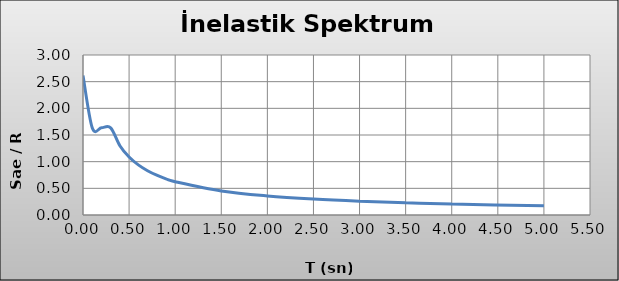
| Category | Series 0 |
|---|---|
| 0.0 | 2.616 |
| 0.1 | 1.635 |
| 0.2 | 1.635 |
| 0.3 | 1.635 |
| 0.4 | 1.299 |
| 0.5 | 1.087 |
| 0.6 | 0.939 |
| 0.7 | 0.83 |
| 0.8 | 0.746 |
| 0.9 | 0.679 |
| 1.0 | 0.624 |
| 1.5 | 0.451 |
| 2.0 | 0.358 |
| 2.5 | 0.3 |
| 3.0 | 0.259 |
| 3.5 | 0.229 |
| 4.0 | 0.206 |
| 5.0 | 0.172 |